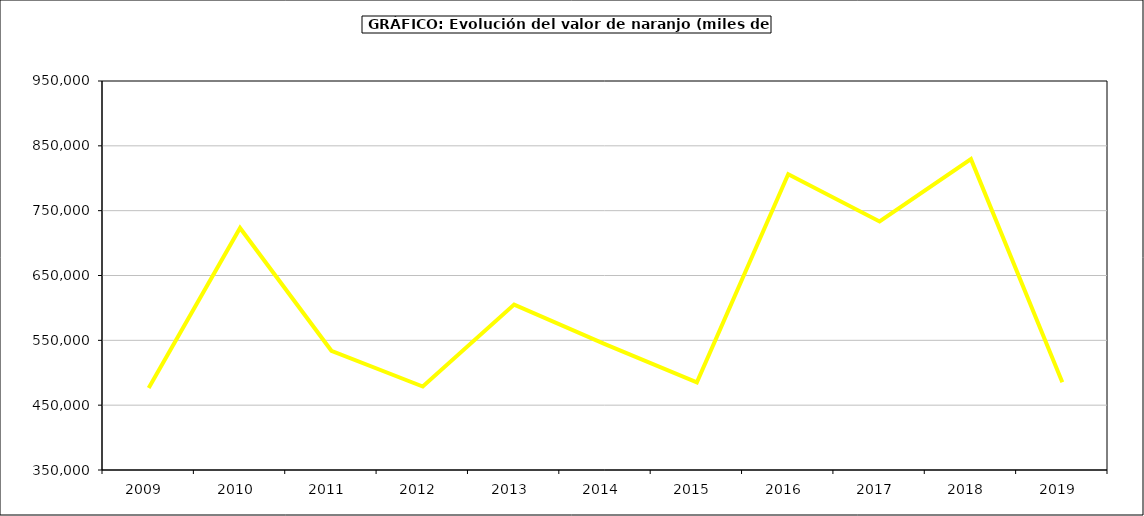
| Category | Valor |
|---|---|
| 2009.0 | 476479.868 |
| 2010.0 | 723258.418 |
| 2011.0 | 533897.387 |
| 2012.0 | 478708.956 |
| 2013.0 | 605137.07 |
| 2014.0 | 543774.818 |
| 2015.0 | 485218 |
| 2016.0 | 806164 |
| 2017.0 | 733433.06 |
| 2018.0 | 829436.538 |
| 2019.0 | 485336.808 |